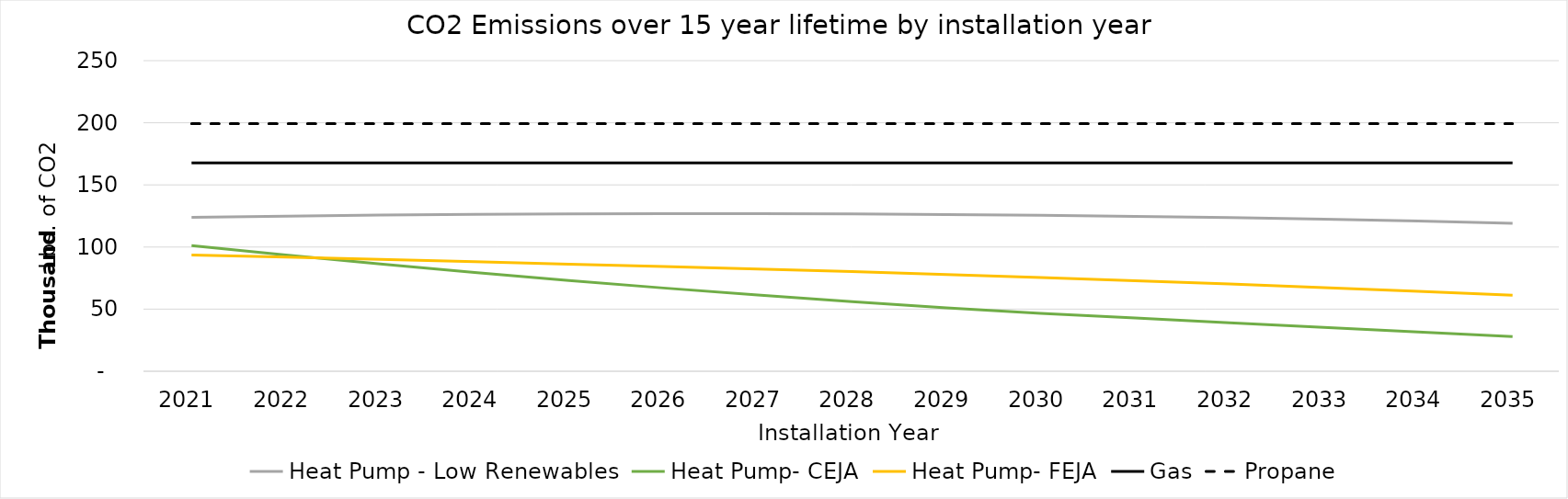
| Category | Heat Pump - Low Renewables | Heat Pump- CEJA | Heat Pump- FEJA | Gas | Propane  |
|---|---|---|---|---|---|
| 2021.0 | 123870.424 | 101166.539 | 93650.419 | 167648.268 | 199243.519 |
| 2022.0 | 124879.26 | 93581.16 | 91838.989 | 167648.268 | 199243.519 |
| 2023.0 | 125677.467 | 86374.626 | 90001.994 | 167648.268 | 199243.519 |
| 2024.0 | 126262.09 | 79546.938 | 88139.435 | 167648.268 | 199243.519 |
| 2025.0 | 126629.986 | 73098.094 | 86251.312 | 167648.268 | 199243.519 |
| 2026.0 | 126807.015 | 67028.095 | 84366.828 | 167648.268 | 199243.519 |
| 2027.0 | 126789.621 | 61336.941 | 82347.208 | 167648.268 | 199243.519 |
| 2028.0 | 126574.021 | 56024.633 | 80192.453 | 167648.268 | 199243.519 |
| 2029.0 | 126156.187 | 51091.169 | 77902.562 | 167648.268 | 199243.519 |
| 2030.0 | 125531.838 | 46536.55 | 75477.534 | 167648.268 | 199243.519 |
| 2031.0 | 124696.418 | 42813.626 | 72917.371 | 167648.268 | 199243.519 |
| 2032.0 | 123645.081 | 39090.702 | 70222.072 | 167648.268 | 199243.519 |
| 2033.0 | 122372.67 | 35367.778 | 67391.637 | 167648.268 | 199243.519 |
| 2034.0 | 120855.134 | 31644.854 | 64407.499 | 167648.268 | 199243.519 |
| 2035.0 | 119086.638 | 27921.93 | 61269.658 | 167648.268 | 199243.519 |